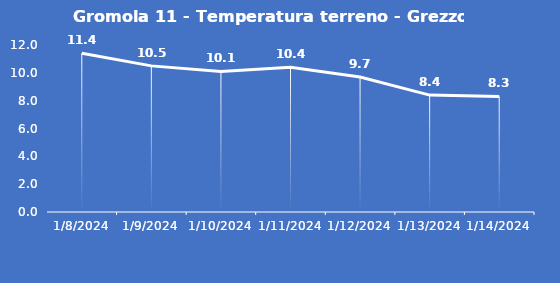
| Category | Gromola 11 - Temperatura terreno - Grezzo (°C) |
|---|---|
| 1/8/24 | 11.4 |
| 1/9/24 | 10.5 |
| 1/10/24 | 10.1 |
| 1/11/24 | 10.4 |
| 1/12/24 | 9.7 |
| 1/13/24 | 8.4 |
| 1/14/24 | 8.3 |